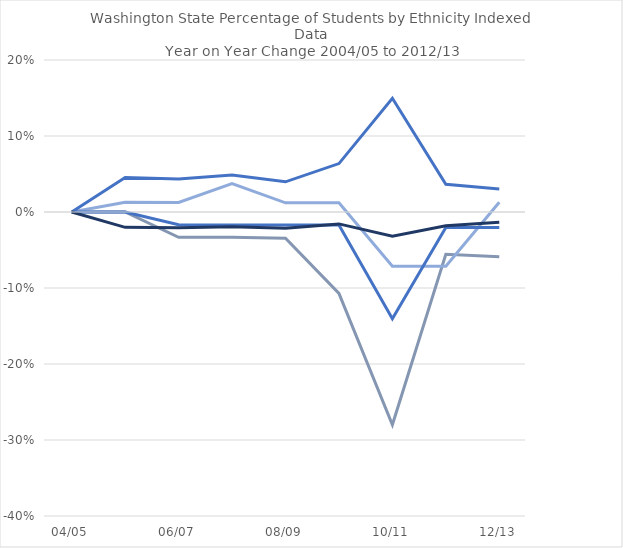
| Category | American Indian | Asian | Black | Hispanic | White |
|---|---|---|---|---|---|
| 04/05 | 0 | 0 | 0 | 0 | 0 |
|  | 0 | 0.013 | 0 | 0.045 | -0.02 |
| 06/07 | -0.033 | 0.013 | -0.017 | 0.043 | -0.021 |
|  | -0.033 | 0.038 | -0.017 | 0.049 | -0.02 |
| 08/09 | -0.034 | 0.012 | -0.017 | 0.04 | -0.021 |
|  | -0.107 | 0.012 | -0.017 | 0.064 | -0.016 |
| 10/11 | -0.28 | -0.071 | -0.14 | 0.15 | -0.032 |
|  | -0.056 | -0.071 | -0.02 | 0.036 | -0.018 |
| 12/13 | -0.059 | 0.013 | -0.02 | 0.03 | -0.013 |